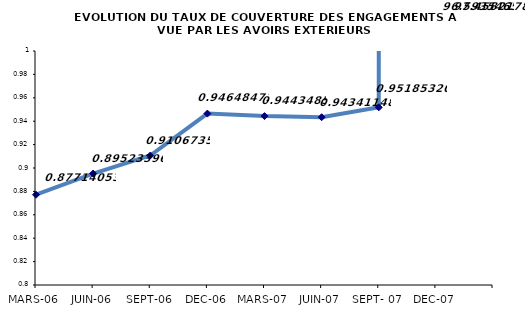
| Category | Series 0 |
|---|---|
| MARS-06 | 0.877 |
| JUIN-06 | 0.895 |
| SEPT-06 | 0.911 |
| DEC-06 | 0.946 |
| MARS-07 | 0.944 |
| JUIN-07 | 0.943 |
| SEPT- 07 | 0.952 |
| DEC-07 | 96.594 |